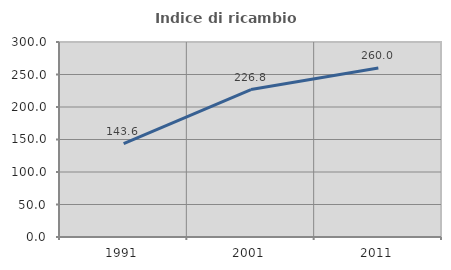
| Category | Indice di ricambio occupazionale  |
|---|---|
| 1991.0 | 143.636 |
| 2001.0 | 226.829 |
| 2011.0 | 260 |